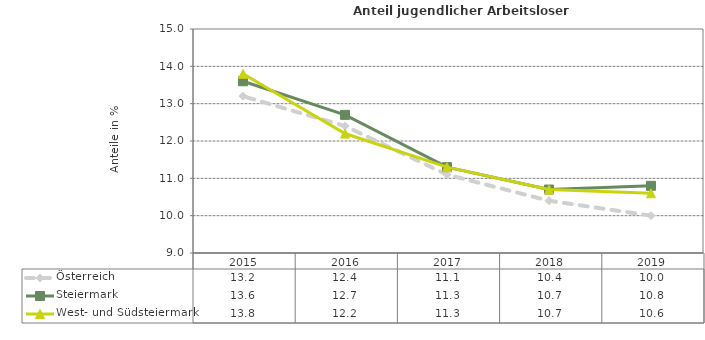
| Category | Österreich | Steiermark | West- und Südsteiermark |
|---|---|---|---|
| 2019.0 | 10 | 10.8 | 10.6 |
| 2018.0 | 10.4 | 10.7 | 10.7 |
| 2017.0 | 11.1 | 11.3 | 11.3 |
| 2016.0 | 12.4 | 12.7 | 12.2 |
| 2015.0 | 13.2 | 13.6 | 13.8 |